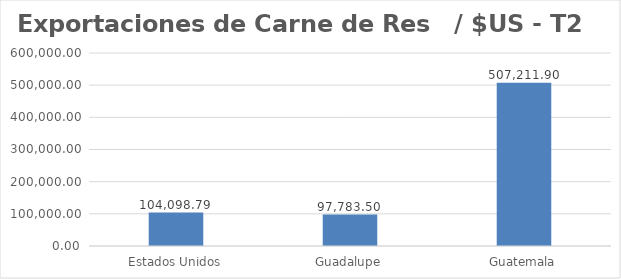
| Category | Series 0 |
|---|---|
| Estados Unidos | 104098.79 |
| Guadalupe | 97783.5 |
| Guatemala | 507211.9 |